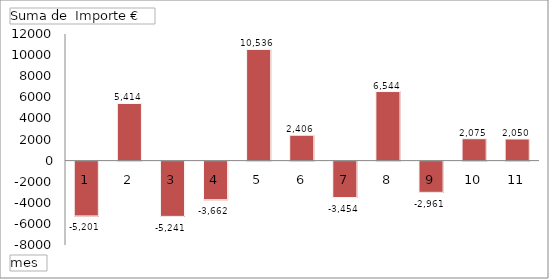
| Category | Total |
|---|---|
| 1 | -5201.22 |
| 2 | 5414.18 |
| 3 | -5240.68 |
| 4 | -3661.8 |
| 5 | 10535.78 |
| 6 | 2405.92 |
| 7 | -3454.38 |
| 8 | 6544.17 |
| 9 | -2960.79 |
| 10 | 2075.13 |
| 11 | 2049.65 |